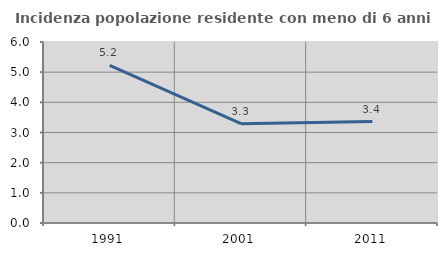
| Category | Incidenza popolazione residente con meno di 6 anni |
|---|---|
| 1991.0 | 5.222 |
| 2001.0 | 3.294 |
| 2011.0 | 3.361 |